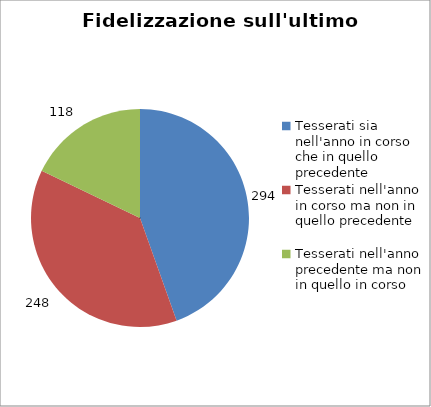
| Category | Nr. Tesserati |
|---|---|
| Tesserati sia nell'anno in corso che in quello precedente | 294 |
| Tesserati nell'anno in corso ma non in quello precedente | 248 |
| Tesserati nell'anno precedente ma non in quello in corso | 118 |